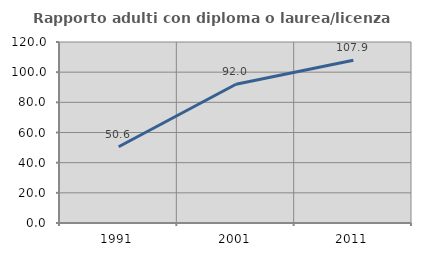
| Category | Rapporto adulti con diploma o laurea/licenza media  |
|---|---|
| 1991.0 | 50.575 |
| 2001.0 | 91.964 |
| 2011.0 | 107.921 |